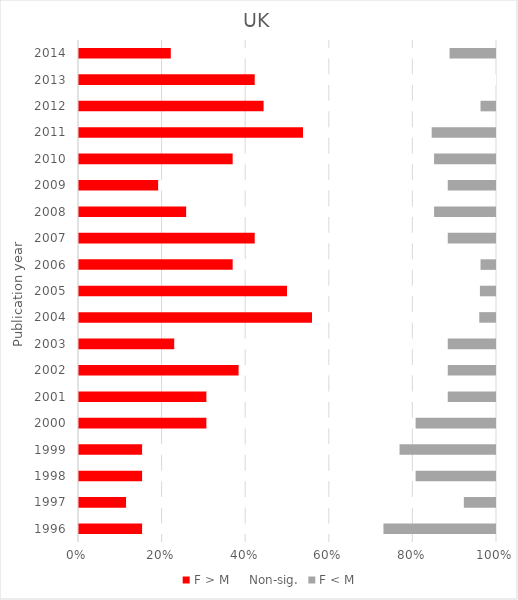
| Category | F > M | Non-sig. | F < M |
|---|---|---|---|
| 1996.0 | 4 | 15 | 7 |
| 1997.0 | 3 | 21 | 2 |
| 1998.0 | 4 | 17 | 5 |
| 1999.0 | 4 | 16 | 6 |
| 2000.0 | 8 | 13 | 5 |
| 2001.0 | 8 | 15 | 3 |
| 2002.0 | 10 | 13 | 3 |
| 2003.0 | 6 | 17 | 3 |
| 2004.0 | 14 | 10 | 1 |
| 2005.0 | 13 | 12 | 1 |
| 2006.0 | 10 | 16 | 1 |
| 2007.0 | 11 | 12 | 3 |
| 2008.0 | 7 | 16 | 4 |
| 2009.0 | 5 | 18 | 3 |
| 2010.0 | 10 | 13 | 4 |
| 2011.0 | 14 | 8 | 4 |
| 2012.0 | 12 | 14 | 1 |
| 2013.0 | 11 | 15 | 0 |
| 2014.0 | 6 | 18 | 3 |